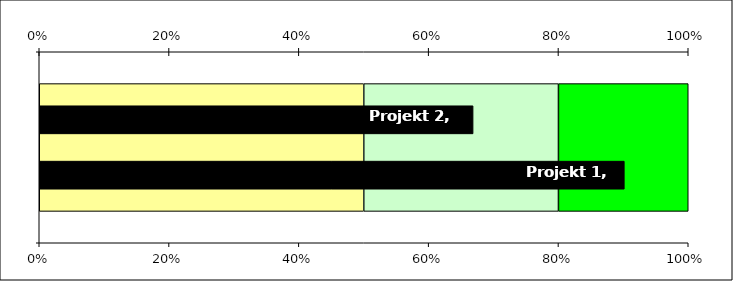
| Category | Series 0 | Series 1 | Series 2 |
|---|---|---|---|
| 0 | 0.5 | 0.3 | 0.2 |